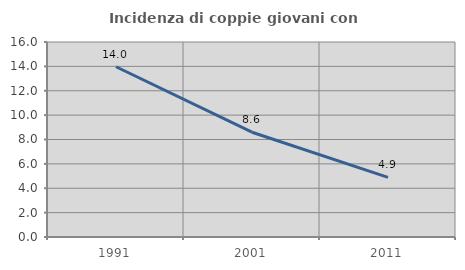
| Category | Incidenza di coppie giovani con figli |
|---|---|
| 1991.0 | 13.97 |
| 2001.0 | 8.598 |
| 2011.0 | 4.891 |